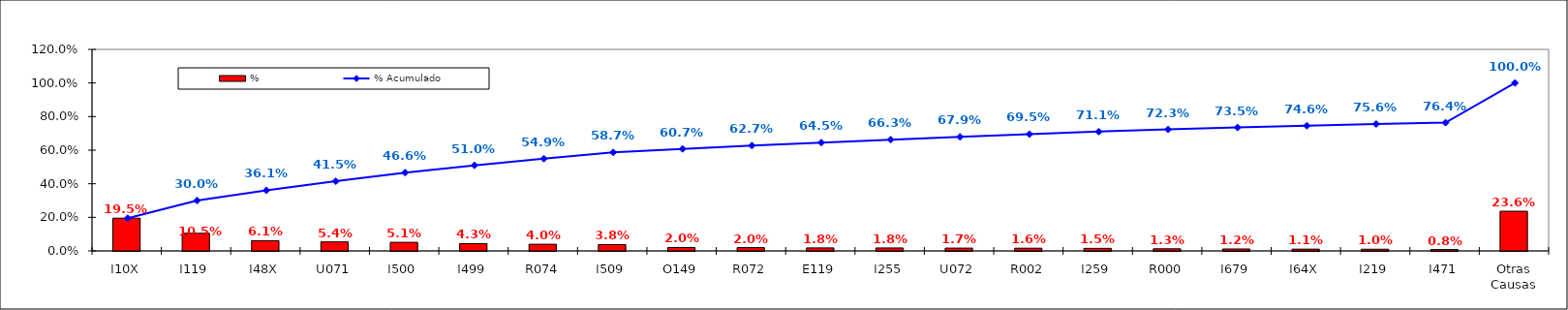
| Category | % |
|---|---|
| I10X | 0.195 |
| I119 | 0.105 |
| I48X | 0.061 |
| U071 | 0.054 |
| I500 | 0.051 |
| I499 | 0.043 |
| R074 | 0.04 |
| I509 | 0.038 |
| O149 | 0.02 |
| R072 | 0.02 |
| E119 | 0.018 |
| I255 | 0.018 |
| U072 | 0.017 |
| R002 | 0.016 |
| I259 | 0.015 |
| R000 | 0.013 |
| I679 | 0.012 |
| I64X | 0.011 |
| I219 | 0.01 |
| I471 | 0.008 |
| Otras Causas | 0.236 |